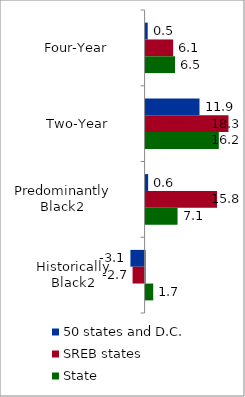
| Category | 50 states and D.C. | SREB states | State |
|---|---|---|---|
| Four-Year | 0.464 | 6.097 | 6.504 |
| Two-Year | 11.926 | 18.336 | 16.201 |
| Predominantly Black2 | 0.568 | 15.809 | 7.071 |
| Historically Black2 | -3.139 | -2.66 | 1.686 |